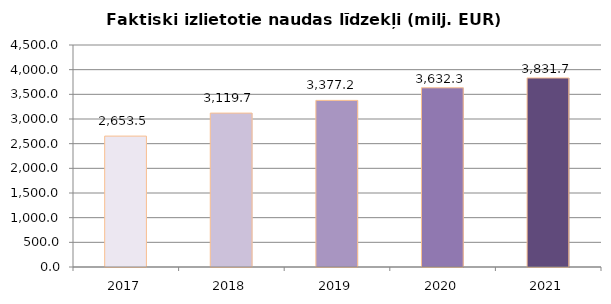
| Category | Faktiski izlietotie naudas līdzekļi (milj. EUR) ar PVN |
|---|---|
| 2017.0 | 2653.503 |
| 2018.0 | 3119.679 |
| 2019.0 | 3377.208 |
| 2020.0 | 3632.314 |
| 2021.0 | 3831.667 |